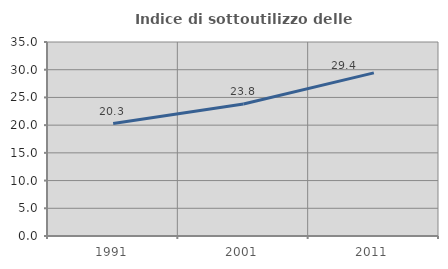
| Category | Indice di sottoutilizzo delle abitazioni  |
|---|---|
| 1991.0 | 20.292 |
| 2001.0 | 23.817 |
| 2011.0 | 29.423 |